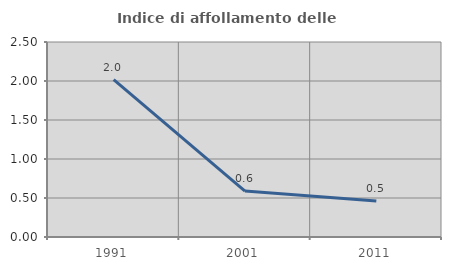
| Category | Indice di affollamento delle abitazioni  |
|---|---|
| 1991.0 | 2.018 |
| 2001.0 | 0.589 |
| 2011.0 | 0.461 |